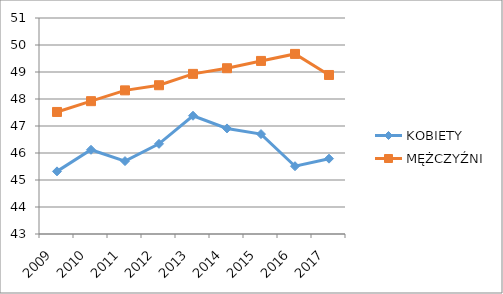
| Category | KOBIETY | MĘŻCZYŹNI |
|---|---|---|
| 2009.0 | 45.32 | 47.52 |
| 2010.0 | 46.12 | 47.92 |
| 2011.0 | 45.7 | 48.32 |
| 2012.0 | 46.34 | 48.51 |
| 2013.0 | 47.38 | 48.93 |
| 2014.0 | 46.91 | 49.14 |
| 2015.0 | 46.7 | 49.41 |
| 2016.0 | 45.51 | 49.67 |
| 2017.0 | 45.79 | 48.89 |